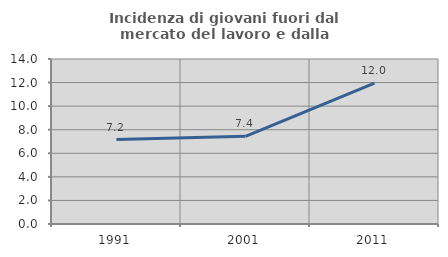
| Category | Incidenza di giovani fuori dal mercato del lavoro e dalla formazione  |
|---|---|
| 1991.0 | 7.163 |
| 2001.0 | 7.443 |
| 2011.0 | 11.957 |